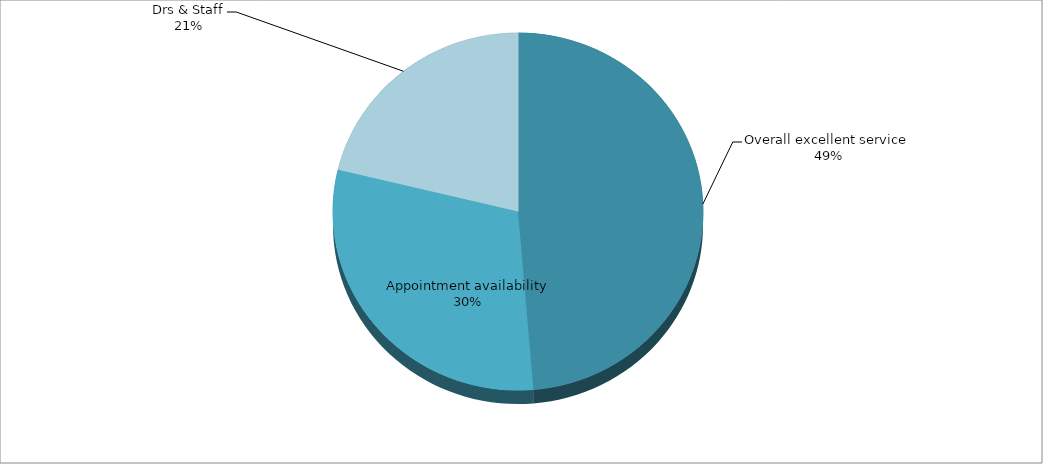
| Category | Series 0 |
|---|---|
| Overall excellent service  | 55 |
| Appointment availability | 34 |
| Drs & Staff | 24 |